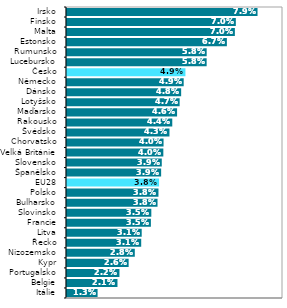
| Category | Series 0 |
|---|---|
| Itálie | 0.013 |
| Belgie | 0.021 |
| Portugalsko | 0.022 |
| Kypr | 0.026 |
| Nizozemsko | 0.028 |
| Řecko | 0.031 |
| Litva | 0.031 |
| Francie | 0.035 |
| Slovinsko | 0.035 |
| Bulharsko | 0.038 |
| Polsko | 0.038 |
| EU28 | 0.038 |
| Španělsko | 0.039 |
| Slovensko | 0.039 |
| Velká Británie | 0.04 |
| Chorvatsko | 0.04 |
| Švédsko | 0.043 |
| Rakousko | 0.044 |
| Maďarsko | 0.046 |
| Lotyšsko | 0.047 |
| Dánsko | 0.048 |
| Německo | 0.049 |
| Česko | 0.049 |
| Lucebursko | 0.058 |
| Rumunsko | 0.058 |
| Estonsko | 0.067 |
| Malta | 0.07 |
| Finsko | 0.07 |
| Irsko | 0.079 |